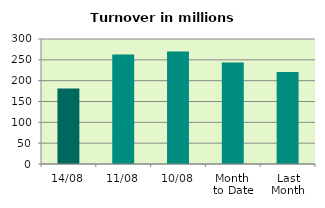
| Category | Series 0 |
|---|---|
| 14/08 | 181.444 |
| 11/08 | 262.93 |
| 10/08 | 270.09 |
| Month 
to Date | 243.567 |
| Last
Month | 220.762 |